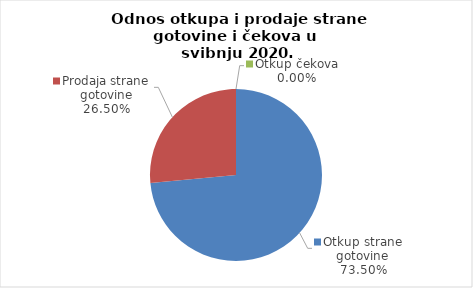
| Category | Series 0 |
|---|---|
| Otkup strane gotovine | 73.496 |
| Prodaja strane gotovine | 26.504 |
| Otkup čekova | 0 |